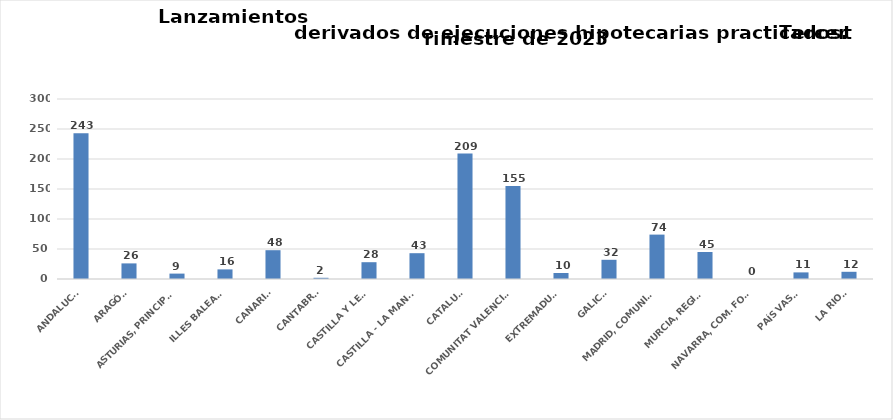
| Category | Series 0 |
|---|---|
| ANDALUCÍA | 243 |
| ARAGÓN | 26 |
| ASTURIAS, PRINCIPADO | 9 |
| ILLES BALEARS | 16 |
| CANARIAS | 48 |
| CANTABRIA | 2 |
| CASTILLA Y LEÓN | 28 |
| CASTILLA - LA MANCHA | 43 |
| CATALUÑA | 209 |
| COMUNITAT VALENCIANA | 155 |
| EXTREMADURA | 10 |
| GALICIA | 32 |
| MADRID, COMUNIDAD | 74 |
| MURCIA, REGIÓN | 45 |
| NAVARRA, COM. FORAL | 0 |
| PAÍS VASCO | 11 |
| LA RIOJA | 12 |